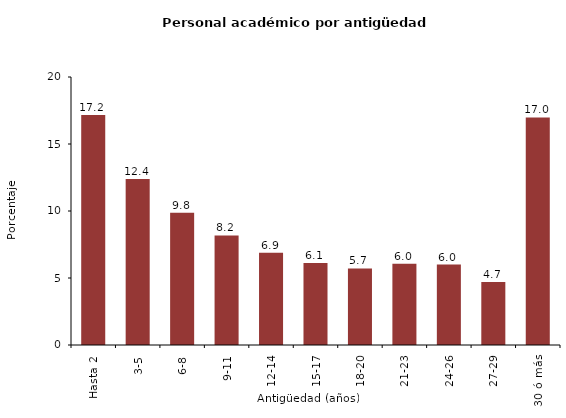
| Category | Series 0 |
|---|---|
| Hasta 2 | 17.162 |
| 3-5 | 12.394 |
| 6-8 | 9.86 |
| 9-11 | 8.173 |
| 12-14 | 6.876 |
| 15-17 | 6.116 |
| 18-20 | 5.712 |
| 21-23 | 6.055 |
| 24-26 | 6 |
| 27-29 | 4.71 |
| 30 ó más | 16.983 |